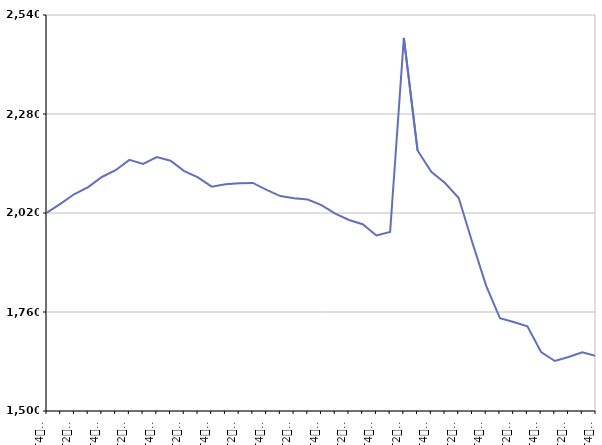
| Category | De 25 à 49 ans |
|---|---|
| T4
2013 | 2021 |
| T1
2014 | 2044.8 |
| T2
2014 | 2069.8 |
| T3
2014 | 2088.1 |
| T4
2014 | 2114.6 |
| T1
2015 | 2132.4 |
| T2
2015 | 2159.5 |
| T3
2015 | 2148.7 |
| T4
2015 | 2166.8 |
| T1
2016 | 2157.4 |
| T2
2016 | 2130.1 |
| T3
2016 | 2113.4 |
| T4
2016 | 2089.1 |
| T1
2017 | 2095.6 |
| T2
2017 | 2098.3 |
| T3
2017 | 2099 |
| T4
2017 | 2080.9 |
| T1
2018 | 2064.5 |
| T2
2018 | 2058.6 |
| T3
2018 | 2055.4 |
| T4
2018 | 2040.9 |
| T1
2019 | 2018.5 |
| T2
2019 | 2001.7 |
| T3
2019 | 1990.4 |
| T4
2019 | 1960.9 |
| T1
2020 | 1970.5 |
| T2
2020 | 2480 |
| T3
2020 | 2184.1 |
| T4
2020 | 2128.2 |
| T1
2021 | 2098.8 |
| T2
2021 | 2059.4 |
| T3
2021 | 1941.2 |
| T4
2021 | 1828.6 |
| T1
2022 | 1744 |
| T2
2022 | 1733.9 |
| T3
2022 | 1722.3 |
| T4
2022 | 1654.8 |
| T1
2023 | 1631.4 |
| T2
2023 | 1641.8 |
| T3
2023 | 1654.1 |
| T4
2023 | 1644.2 |